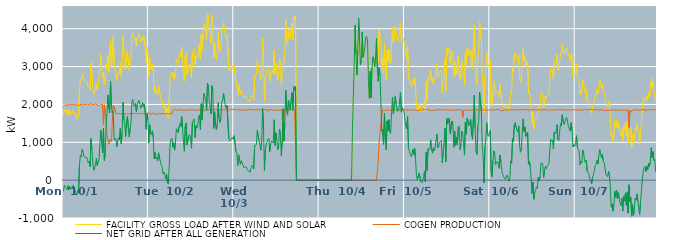
| Category | FACILITY GROSS LOAD AFTER WIND AND SOLAR | COGEN PRODUCTION | NET GRID AFTER ALL GENERATION |
|---|---|---|---|
|  Mon  10/1 | 1690 | 1989 | -299 |
|  Mon  10/1 | 1880 | 2011 | -131 |
|  Mon  10/1 | 1806 | 1982 | -176 |
|  Mon  10/1 | 1848 | 2003 | -155 |
|  Mon  10/1 | 1740 | 1993 | -253 |
|  Mon  10/1 | 1854 | 2001 | -147 |
|  Mon  10/1 | 1728 | 1988 | -260 |
|  Mon  10/1 | 1838 | 2000 | -162 |
|  Mon  10/1 | 1761 | 1996 | -235 |
|  Mon  10/1 | 1754 | 1976 | -222 |
|  Mon  10/1 | 1769 | 1996 | -227 |
|  Mon  10/1 | 1867 | 1996 | -129 |
|  Mon  10/1 | 1845 | 1993 | -148 |
|  Mon  10/1 | 1721 | 1996 | -275 |
|  Mon  10/1 | 1656 | 1991 | -335 |
|  Mon  10/1 | 1599 | 1998 | -399 |
|  Mon  10/1 | 1712 | 1986 | -274 |
|  Mon  10/1 | 1654 | 1993 | -339 |
|  Mon  10/1 | 2359 | 1979 | 380 |
|  Mon  10/1 | 2666 | 2002 | 664 |
|  Mon  10/1 | 2630 | 2011 | 619 |
|  Mon  10/1 | 2792 | 1984 | 808 |
|  Mon  10/1 | 2725 | 1988 | 737 |
|  Mon  10/1 | 2627 | 1998 | 629 |
|  Mon  10/1 | 2595 | 1996 | 599 |
|  Mon  10/1 | 2582 | 2000 | 582 |
|  Mon  10/1 | 2606 | 1997 | 609 |
|  Mon  10/1 | 2538 | 2008 | 530 |
|  Mon  10/1 | 2437 | 1982 | 455 |
|  Mon  10/1 | 2479 | 1986 | 493 |
|  Mon  10/1 | 2375 | 2021 | 354 |
|  Mon  10/1 | 3103 | 2004 | 1099 |
|  Mon  10/1 | 2826 | 2002 | 824 |
|  Mon  10/1 | 2466 | 1991 | 475 |
|  Mon  10/1 | 2257 | 1995 | 262 |
|  Mon  10/1 | 2312 | 1990 | 322 |
|  Mon  10/1 | 2404 | 2010 | 394 |
|  Mon  10/1 | 2561 | 1984 | 577 |
|  Mon  10/1 | 2384 | 1996 | 388 |
|  Mon  10/1 | 2486 | 2002 | 484 |
|  Mon  10/1 | 2501 | 1969 | 532 |
|  Mon  10/1 | 2968 | 1995 | 973 |
|  Mon  10/1 | 3319 | 1997 | 1322 |
|  Mon  10/1 | 2983 | 1998 | 985 |
|  Mon  10/1 | 2719 | 1995 | 724 |
|  Mon  10/1 | 2843 | 1470 | 1373 |
|  Mon  10/1 | 2512 | 1993 | 519 |
|  Mon  10/1 | 2680 | 1994 | 686 |
|  Mon  10/1 | 3076 | 1597 | 1479 |
|  Mon  10/1 | 2936 | 1177 | 1759 |
|  Mon  10/1 | 3300 | 1049 | 2251 |
|  Mon  10/1 | 2853 | 949 | 1904 |
|  Mon  10/1 | 2862 | 1085 | 1777 |
|  Mon  10/1 | 3708 | 1096 | 2612 |
|  Mon  10/1 | 2966 | 1016 | 1950 |
|  Mon  10/1 | 3360 | 1579 | 1781 |
|  Mon  10/1 | 3800 | 1980 | 1820 |
|  Mon  10/1 | 3037 | 1977 | 1060 |
|  Mon  10/1 | 2913 | 1858 | 1055 |
|  Mon  10/1 | 2857 | 1757 | 1100 |
|  Mon  10/1 | 2626 | 1746 | 880 |
|  Mon  10/1 | 2785 | 1753 | 1032 |
|  Mon  10/1 | 2857 | 1735 | 1122 |
|  Mon  10/1 | 2824 | 1765 | 1059 |
|  Mon  10/1 | 3129 | 1764 | 1365 |
|  Mon  10/1 | 2719 | 1752 | 967 |
|  Mon  10/1 | 3023 | 1761 | 1262 |
|  Mon  10/1 | 3808 | 1747 | 2061 |
|  Mon  10/1 | 3344 | 1752 | 1592 |
|  Mon  10/1 | 3209 | 1754 | 1455 |
|  Mon  10/1 | 2909 | 1757 | 1152 |
|  Mon  10/1 | 3344 | 1753 | 1591 |
|  Mon  10/1 | 3433 | 1747 | 1686 |
|  Mon  10/1 | 3119 | 1749 | 1370 |
|  Mon  10/1 | 2896 | 1757 | 1139 |
|  Mon  10/1 | 3126 | 1755 | 1371 |
|  Mon  10/1 | 3274 | 1755 | 1519 |
|  Mon  10/1 | 3838 | 1764 | 2074 |
|  Mon  10/1 | 3889 | 1759 | 2130 |
|  Mon  10/1 | 3741 | 1761 | 1980 |
|  Mon  10/1 | 3699 | 1748 | 1951 |
|  Mon  10/1 | 3786 | 1759 | 2027 |
|  Mon  10/1 | 3548 | 1735 | 1813 |
|  Mon  10/1 | 3758 | 1752 | 2006 |
|  Mon  10/1 | 3778 | 1758 | 2020 |
|  Mon  10/1 | 3877 | 1764 | 2113 |
|  Mon  10/1 | 3764 | 1767 | 1997 |
|  Mon  10/1 | 3649 | 1751 | 1898 |
|  Mon  10/1 | 3698 | 1734 | 1964 |
|  Mon  10/1 | 3805 | 1760 | 2045 |
|  Mon  10/1 | 3687 | 1758 | 1929 |
|  Mon  10/1 | 3750 | 1748 | 2002 |
|  Mon  10/1 | 3511 | 1761 | 1750 |
|  Mon  10/1 | 3116 | 1770 | 1346 |
|  Mon  10/1 | 3520 | 1766 | 1754 |
|  Mon  10/1 | 3369 | 1769 | 1600 |
|  Tue  10/2 | 2745 | 1759 | 986 |
|  Tue  10/2 | 3227 | 1766 | 1461 |
|  Tue  10/2 | 2979 | 1751 | 1228 |
|  Tue  10/2 | 2930 | 1732 | 1198 |
|  Tue  10/2 | 3075 | 1769 | 1306 |
|  Tue  10/2 | 2878 | 1748 | 1130 |
|  Tue  10/2 | 2321 | 1754 | 567 |
|  Tue  10/2 | 2490 | 1759 | 731 |
|  Tue  10/2 | 2297 | 1738 | 559 |
|  Tue  10/2 | 2339 | 1747 | 592 |
|  Tue  10/2 | 2260 | 1751 | 509 |
|  Tue  10/2 | 2479 | 1759 | 720 |
|  Tue  10/2 | 2342 | 1752 | 590 |
|  Tue  10/2 | 2325 | 1746 | 579 |
|  Tue  10/2 | 2138 | 1745 | 393 |
|  Tue  10/2 | 2103 | 1748 | 355 |
|  Tue  10/2 | 1929 | 1765 | 164 |
|  Tue  10/2 | 1973 | 1762 | 211 |
|  Tue  10/2 | 1903 | 1745 | 158 |
|  Tue  10/2 | 1789 | 1758 | 31 |
|  Tue  10/2 | 1913 | 1760 | 153 |
|  Tue  10/2 | 1695 | 1763 | -68 |
|  Tue  10/2 | 1637 | 1744 | -107 |
|  Tue  10/2 | 2150 | 1745 | 405 |
|  Tue  10/2 | 2728 | 1771 | 957 |
|  Tue  10/2 | 2819 | 1746 | 1073 |
|  Tue  10/2 | 2854 | 1744 | 1110 |
|  Tue  10/2 | 2717 | 1848 | 869 |
|  Tue  10/2 | 2844 | 1857 | 987 |
|  Tue  10/2 | 2661 | 1868 | 793 |
|  Tue  10/2 | 2852 | 1855 | 997 |
|  Tue  10/2 | 3205 | 1844 | 1361 |
|  Tue  10/2 | 3183 | 1853 | 1330 |
|  Tue  10/2 | 3115 | 1856 | 1259 |
|  Tue  10/2 | 3258 | 1849 | 1409 |
|  Tue  10/2 | 3359 | 1870 | 1489 |
|  Tue  10/2 | 3263 | 1852 | 1411 |
|  Tue  10/2 | 3520 | 1841 | 1679 |
|  Tue  10/2 | 3197 | 1859 | 1338 |
|  Tue  10/2 | 2848 | 1854 | 994 |
|  Tue  10/2 | 2613 | 1849 | 764 |
|  Tue  10/2 | 3282 | 1849 | 1433 |
|  Tue  10/2 | 3349 | 1839 | 1510 |
|  Tue  10/2 | 2779 | 1852 | 927 |
|  Tue  10/2 | 2777 | 1859 | 918 |
|  Tue  10/2 | 3020 | 1847 | 1173 |
|  Tue  10/2 | 3069 | 1869 | 1200 |
|  Tue  10/2 | 2943 | 1862 | 1081 |
|  Tue  10/2 | 2687 | 1848 | 839 |
|  Tue  10/2 | 3390 | 1862 | 1528 |
|  Tue  10/2 | 3430 | 1859 | 1571 |
|  Tue  10/2 | 3470 | 1854 | 1616 |
|  Tue  10/2 | 2999 | 1873 | 1126 |
|  Tue  10/2 | 3285 | 1847 | 1438 |
|  Tue  10/2 | 3230 | 1852 | 1378 |
|  Tue  10/2 | 3265 | 1849 | 1416 |
|  Tue  10/2 | 3520 | 1839 | 1681 |
|  Tue  10/2 | 3586 | 1863 | 1723 |
|  Tue  10/2 | 3185 | 1857 | 1328 |
|  Tue  10/2 | 3862 | 1842 | 2020 |
|  Tue  10/2 | 3451 | 1850 | 1601 |
|  Tue  10/2 | 3858 | 1849 | 2009 |
|  Tue  10/2 | 4131 | 1844 | 2287 |
|  Tue  10/2 | 4048 | 1851 | 2197 |
|  Tue  10/2 | 3962 | 1865 | 2097 |
|  Tue  10/2 | 3703 | 1856 | 1847 |
|  Tue  10/2 | 4400 | 1847 | 2553 |
|  Tue  10/2 | 4344 | 1862 | 2482 |
|  Tue  10/2 | 3897 | 1839 | 2058 |
|  Tue  10/2 | 3785 | 1849 | 1936 |
|  Tue  10/2 | 3614 | 1866 | 1748 |
|  Tue  10/2 | 4348 | 1851 | 2497 |
|  Tue  10/2 | 4209 | 1855 | 2354 |
|  Tue  10/2 | 3224 | 1858 | 1366 |
|  Tue  10/2 | 3654 | 1847 | 1807 |
|  Tue  10/2 | 3314 | 1869 | 1445 |
|  Tue  10/2 | 3190 | 1863 | 1327 |
|  Tue  10/2 | 3346 | 1850 | 1496 |
|  Tue  10/2 | 3913 | 1867 | 2046 |
|  Tue  10/2 | 3467 | 1835 | 1632 |
|  Tue  10/2 | 3388 | 1862 | 1526 |
|  Tue  10/2 | 3497 | 1858 | 1639 |
|  Tue  10/2 | 3903 | 1857 | 2046 |
|  Tue  10/2 | 3969 | 1856 | 2113 |
|  Tue  10/2 | 4160 | 1858 | 2302 |
|  Tue  10/2 | 3972 | 1851 | 2121 |
|  Tue  10/2 | 3843 | 1860 | 1983 |
|  Tue  10/2 | 3755 | 1859 | 1896 |
|  Tue  10/2 | 3819 | 1843 | 1976 |
|  Tue  10/2 | 3811 | 1859 | 1952 |
|  Tue  10/2 | 2947 | 1846 | 1101 |
|  Tue  10/2 | 2878 | 1844 | 1034 |
|  Tue  10/2 | 2937 | 1869 | 1068 |
|  Tue  10/2 | 2922 | 1850 | 1072 |
|  Tue  10/2 | 3012 | 1882 | 1130 |
|  Tue  10/2 | 2923 | 1848 | 1075 |
|  Wed  10/3 | 3018 | 1843 | 1175 |
|  Wed  10/3 | 3041 | 1874 | 1167 |
|  Wed  10/3 | 2617 | 1856 | 761 |
|  Wed  10/3 | 2565 | 1856 | 709 |
|  Wed  10/3 | 2234 | 1847 | 387 |
|  Wed  10/3 | 2520 | 1854 | 666 |
|  Wed  10/3 | 2405 | 1868 | 537 |
|  Wed  10/3 | 2269 | 1850 | 419 |
|  Wed  10/3 | 2382 | 1870 | 512 |
|  Wed  10/3 | 2331 | 1858 | 473 |
|  Wed  10/3 | 2236 | 1854 | 382 |
|  Wed  10/3 | 2180 | 1846 | 334 |
|  Wed  10/3 | 2199 | 1851 | 348 |
|  Wed  10/3 | 2204 | 1846 | 358 |
|  Wed  10/3 | 2204 | 1871 | 333 |
|  Wed  10/3 | 2134 | 1861 | 273 |
|  Wed  10/3 | 2083 | 1842 | 241 |
|  Wed  10/3 | 2125 | 1865 | 260 |
|  Wed  10/3 | 2075 | 1864 | 211 |
|  Wed  10/3 | 2192 | 1863 | 329 |
|  Wed  10/3 | 2250 | 1865 | 385 |
|  Wed  10/3 | 2207 | 1856 | 351 |
|  Wed  10/3 | 2131 | 1832 | 299 |
|  Wed  10/3 | 2767 | 1855 | 912 |
|  Wed  10/3 | 2767 | 1859 | 908 |
|  Wed  10/3 | 2788 | 1851 | 937 |
|  Wed  10/3 | 3166 | 1852 | 1314 |
|  Wed  10/3 | 3176 | 1862 | 1314 |
|  Wed  10/3 | 2890 | 1845 | 1045 |
|  Wed  10/3 | 2777 | 1856 | 921 |
|  Wed  10/3 | 2655 | 1864 | 791 |
|  Wed  10/3 | 2901 | 1846 | 1055 |
|  Wed  10/3 | 3751 | 1853 | 1898 |
|  Wed  10/3 | 3237 | 1860 | 1377 |
|  Wed  10/3 | 2099 | 1843 | 256 |
|  Wed  10/3 | 2664 | 1857 | 807 |
|  Wed  10/3 | 2777 | 1847 | 930 |
|  Wed  10/3 | 2881 | 1855 | 1026 |
|  Wed  10/3 | 2891 | 1822 | 1069 |
|  Wed  10/3 | 2969 | 1864 | 1105 |
|  Wed  10/3 | 2614 | 1861 | 753 |
|  Wed  10/3 | 2815 | 1864 | 951 |
|  Wed  10/3 | 2883 | 1845 | 1038 |
|  Wed  10/3 | 2914 | 1864 | 1050 |
|  Wed  10/3 | 2818 | 1838 | 980 |
|  Wed  10/3 | 3436 | 1841 | 1595 |
|  Wed  10/3 | 2777 | 1863 | 914 |
|  Wed  10/3 | 3098 | 1846 | 1252 |
|  Wed  10/3 | 2933 | 1861 | 1072 |
|  Wed  10/3 | 2658 | 1848 | 810 |
|  Wed  10/3 | 2756 | 1873 | 883 |
|  Wed  10/3 | 3197 | 1848 | 1349 |
|  Wed  10/3 | 3056 | 1854 | 1202 |
|  Wed  10/3 | 2507 | 1859 | 648 |
|  Wed  10/3 | 2861 | 1829 | 1032 |
|  Wed  10/3 | 2900 | 1013 | 1887 |
|  Wed  10/3 | 2884 | 1845 | 1039 |
|  Wed  10/3 | 3387 | 1862 | 1525 |
|  Wed  10/3 | 4243 | 1867 | 2376 |
|  Wed  10/3 | 3716 | 1845 | 1871 |
|  Wed  10/3 | 3585 | 1868 | 1717 |
|  Wed  10/3 | 3956 | 1850 | 2106 |
|  Wed  10/3 | 3824 | 1844 | 1980 |
|  Wed  10/3 | 3729 | 1869 | 1860 |
|  Wed  10/3 | 3705 | 1861 | 1844 |
|  Wed  10/3 | 4151 | 1840 | 2311 |
|  Wed  10/3 | 3710 | 1860 | 1850 |
|  Wed  10/3 | 4329 | 1859 | 2470 |
|  Wed  10/3 | 4232 | 1855 | 2377 |
|  Wed  10/3 | 4339 | 1863 | 2476 |
|  Wed  10/3 | 0 | 0 | 0 |
|  Wed  10/3 | 0 | 0 | 0 |
|  Wed  10/3 | 0 | 0 | 0 |
|  Wed  10/3 | 0 | 0 | 0 |
|  Wed  10/3 | 0 | 0 | 0 |
|  Wed  10/3 | 0 | 0 | 0 |
|  Wed  10/3 | 0 | 0 | 0 |
|  Wed  10/3 | 0 | 0 | 0 |
|  Wed  10/3 | 0 | 0 | 0 |
|  Wed  10/3 | 0 | 0 | 0 |
|  Wed  10/3 | 0 | 0 | 0 |
|  Wed  10/3 | 0 | 0 | 0 |
|  Wed  10/3 | 0 | 0 | 0 |
|  Wed  10/3 | 0 | 0 | 0 |
|  Wed  10/3 | 0 | 0 | 0 |
|  Wed  10/3 | 0 | 0 | 0 |
|  Wed  10/3 | 0 | 0 | 0 |
|  Wed  10/3 | 0 | 0 | 0 |
|  Wed  10/3 | 0 | 0 | 0 |
|  Wed  10/3 | 0 | 0 | 0 |
|  Wed  10/3 | 0 | 0 | 0 |
|  Wed  10/3 | 0 | 0 | 0 |
|  Wed  10/3 | 0 | 0 | 0 |
|  Wed  10/3 | 0 | 0 | 0 |
|  Wed  10/3 | 0 | 0 | 0 |
|  Wed  10/3 | 0 | 0 | 0 |
|  Thu  10/4 | 0 | 0 | 0 |
|  Thu  10/4 | 0 | 0 | 0 |
|  Thu  10/4 | 0 | 0 | 0 |
|  Thu  10/4 | 0 | 0 | 0 |
|  Thu  10/4 | 0 | 0 | 0 |
|  Thu  10/4 | 0 | 0 | 0 |
|  Thu  10/4 | 0 | 0 | 0 |
|  Thu  10/4 | 0 | 0 | 0 |
|  Thu  10/4 | 0 | 0 | 0 |
|  Thu  10/4 | 0 | 0 | 0 |
|  Thu  10/4 | 0 | 0 | 0 |
|  Thu  10/4 | 0 | 0 | 0 |
|  Thu  10/4 | 0 | 0 | 0 |
|  Thu  10/4 | 0 | 0 | 0 |
|  Thu  10/4 | 0 | 0 | 0 |
|  Thu  10/4 | 0 | 0 | 0 |
|  Thu  10/4 | 0 | 0 | 0 |
|  Thu  10/4 | 0 | 0 | 0 |
|  Thu  10/4 | 0 | 0 | 0 |
|  Thu  10/4 | 0 | 0 | 0 |
|  Thu  10/4 | 0 | 0 | 0 |
|  Thu  10/4 | 0 | 0 | 0 |
|  Thu  10/4 | 0 | 0 | 0 |
|  Thu  10/4 | 0 | 0 | 0 |
|  Thu  10/4 | 0 | 0 | 0 |
|  Thu  10/4 | 0 | 0 | 0 |
|  Thu  10/4 | 0 | 0 | 0 |
|  Thu  10/4 | 0 | 0 | 0 |
|  Thu  10/4 | 0 | 0 | 0 |
|  Thu  10/4 | 0 | 0 | 0 |
|  Thu  10/4 | 0 | 0 | 0 |
|  Thu  10/4 | 0 | 0 | 0 |
|  Thu  10/4 | 0 | 0 | 0 |
|  Thu  10/4 | 0 | 0 | 0 |
|  Thu  10/4 | 0 | 0 | 0 |
|  Thu  10/4 | 0 | 0 | 0 |
|  Thu  10/4 | 0 | 0 | 0 |
|  Thu  10/4 | 1342 | 0 | 1342 |
|  Thu  10/4 | 2233 | 0 | 2233 |
|  Thu  10/4 | 3062 | 0 | 3062 |
|  Thu  10/4 | 4096 | 0 | 4096 |
|  Thu  10/4 | 3315 | 0 | 3315 |
|  Thu  10/4 | 2775 | 0 | 2775 |
|  Thu  10/4 | 3445 | 0 | 3445 |
|  Thu  10/4 | 4273 | 0 | 4273 |
|  Thu  10/4 | 3673 | 0 | 3673 |
|  Thu  10/4 | 3043 | 0 | 3043 |
|  Thu  10/4 | 3152 | 0 | 3152 |
|  Thu  10/4 | 3918 | 0 | 3918 |
|  Thu  10/4 | 3248 | 0 | 3248 |
|  Thu  10/4 | 3373 | 0 | 3373 |
|  Thu  10/4 | 3518 | 0 | 3518 |
|  Thu  10/4 | 3773 | 0 | 3773 |
|  Thu  10/4 | 3800 | 0 | 3800 |
|  Thu  10/4 | 3708 | 0 | 3708 |
|  Thu  10/4 | 2610 | 0 | 2610 |
|  Thu  10/4 | 2160 | 0 | 2160 |
|  Thu  10/4 | 2877 | 0 | 2877 |
|  Thu  10/4 | 2172 | 0 | 2172 |
|  Thu  10/4 | 2960 | 0 | 2960 |
|  Thu  10/4 | 3260 | 0 | 3260 |
|  Thu  10/4 | 3163 | 0 | 3163 |
|  Thu  10/4 | 2994 | 0 | 2994 |
|  Thu  10/4 | 3251 | 0 | 3251 |
|  Thu  10/4 | 3745 | 0 | 3745 |
|  Thu  10/4 | 3204 | 248 | 2956 |
|  Thu  10/4 | 3110 | 498 | 2612 |
|  Thu  10/4 | 3994 | 1019 | 2975 |
|  Thu  10/4 | 3784 | 1015 | 2769 |
|  Thu  10/4 | 3556 | 1514 | 2042 |
|  Thu  10/4 | 2979 | 1693 | 1286 |
|  Thu  10/4 | 3207 | 1858 | 1349 |
|  Thu  10/4 | 2801 | 1855 | 946 |
|  Thu  10/4 | 3616 | 1845 | 1771 |
|  Thu  10/4 | 2910 | 1845 | 1065 |
|  Thu  10/4 | 2654 | 1847 | 807 |
|  Thu  10/4 | 3426 | 1859 | 1567 |
|  Thu  10/4 | 3162 | 1855 | 1307 |
|  Thu  10/4 | 3466 | 1869 | 1597 |
|  Thu  10/4 | 3126 | 1851 | 1275 |
|  Thu  10/4 | 3074 | 1837 | 1237 |
|  Thu  10/4 | 3619 | 1838 | 1781 |
|  Thu  10/4 | 4038 | 1854 | 2184 |
|  Thu  10/4 | 3615 | 1857 | 1758 |
|  Thu  10/4 | 3785 | 1842 | 1943 |
|  Thu  10/4 | 4064 | 1853 | 2211 |
|  Thu  10/4 | 4048 | 1860 | 2188 |
|  Thu  10/4 | 3729 | 1860 | 1869 |
|  Thu  10/4 | 3661 | 1844 | 1817 |
|  Thu  10/4 | 3712 | 1861 | 1851 |
|  Thu  10/4 | 3710 | 1857 | 1853 |
|  Thu  10/4 | 4159 | 1847 | 2312 |
|  Thu  10/4 | 3659 | 1862 | 1797 |
|  Thu  10/4 | 3790 | 1869 | 1921 |
|  Thu  10/4 | 3739 | 1872 | 1867 |
|  Thu  10/4 | 3660 | 1852 | 1808 |
|  Fri  10/5 | 3459 | 1864 | 1595 |
|  Fri  10/5 | 3310 | 1881 | 1429 |
|  Fri  10/5 | 3192 | 1841 | 1351 |
|  Fri  10/5 | 3538 | 1855 | 1683 |
|  Fri  10/5 | 2700 | 1844 | 856 |
|  Fri  10/5 | 2630 | 1865 | 765 |
|  Fri  10/5 | 2531 | 1852 | 679 |
|  Fri  10/5 | 2478 | 1854 | 624 |
|  Fri  10/5 | 2550 | 1858 | 692 |
|  Fri  10/5 | 2662 | 1848 | 814 |
|  Fri  10/5 | 2517 | 1853 | 664 |
|  Fri  10/5 | 2713 | 1870 | 843 |
|  Fri  10/5 | 2415 | 1857 | 558 |
|  Fri  10/5 | 1972 | 1860 | 112 |
|  Fri  10/5 | 1849 | 1832 | 17 |
|  Fri  10/5 | 1881 | 1855 | 26 |
|  Fri  10/5 | 2033 | 1853 | 180 |
|  Fri  10/5 | 2016 | 1849 | 167 |
|  Fri  10/5 | 1808 | 1844 | -36 |
|  Fri  10/5 | 1791 | 1862 | -71 |
|  Fri  10/5 | 1863 | 1875 | -12 |
|  Fri  10/5 | 1958 | 1859 | 99 |
|  Fri  10/5 | 2094 | 1856 | 238 |
|  Fri  10/5 | 1811 | 1856 | -45 |
|  Fri  10/5 | 2601 | 1868 | 733 |
|  Fri  10/5 | 2109 | 1852 | 257 |
|  Fri  10/5 | 2680 | 1852 | 828 |
|  Fri  10/5 | 2712 | 1862 | 850 |
|  Fri  10/5 | 2673 | 1859 | 814 |
|  Fri  10/5 | 2896 | 1832 | 1064 |
|  Fri  10/5 | 2650 | 1852 | 798 |
|  Fri  10/5 | 2557 | 1843 | 714 |
|  Fri  10/5 | 2700 | 1846 | 854 |
|  Fri  10/5 | 2622 | 1842 | 780 |
|  Fri  10/5 | 2707 | 1861 | 846 |
|  Fri  10/5 | 2914 | 1852 | 1062 |
|  Fri  10/5 | 3077 | 1857 | 1220 |
|  Fri  10/5 | 2705 | 1856 | 849 |
|  Fri  10/5 | 2756 | 1863 | 893 |
|  Fri  10/5 | 2869 | 1865 | 1004 |
|  Fri  10/5 | 2886 | 1866 | 1020 |
|  Fri  10/5 | 2899 | 1854 | 1045 |
|  Fri  10/5 | 2312 | 1852 | 460 |
|  Fri  10/5 | 2599 | 1867 | 732 |
|  Fri  10/5 | 2799 | 1835 | 964 |
|  Fri  10/5 | 3212 | 1841 | 1371 |
|  Fri  10/5 | 2353 | 1869 | 484 |
|  Fri  10/5 | 3496 | 1860 | 1636 |
|  Fri  10/5 | 3323 | 1842 | 1481 |
|  Fri  10/5 | 3433 | 1846 | 1587 |
|  Fri  10/5 | 3505 | 1862 | 1643 |
|  Fri  10/5 | 3078 | 1853 | 1225 |
|  Fri  10/5 | 3061 | 1842 | 1219 |
|  Fri  10/5 | 3413 | 1854 | 1559 |
|  Fri  10/5 | 3314 | 1854 | 1460 |
|  Fri  10/5 | 2725 | 1858 | 867 |
|  Fri  10/5 | 3137 | 1841 | 1296 |
|  Fri  10/5 | 2765 | 1850 | 915 |
|  Fri  10/5 | 2984 | 1855 | 1129 |
|  Fri  10/5 | 2795 | 1864 | 931 |
|  Fri  10/5 | 3267 | 1865 | 1402 |
|  Fri  10/5 | 3277 | 1846 | 1431 |
|  Fri  10/5 | 2665 | 1857 | 808 |
|  Fri  10/5 | 2791 | 1854 | 937 |
|  Fri  10/5 | 3139 | 1847 | 1292 |
|  Fri  10/5 | 2849 | 1649 | 1200 |
|  Fri  10/5 | 2822 | 1853 | 969 |
|  Fri  10/5 | 2525 | 1864 | 661 |
|  Fri  10/5 | 3377 | 1844 | 1533 |
|  Fri  10/5 | 3058 | 1842 | 1216 |
|  Fri  10/5 | 3489 | 1856 | 1633 |
|  Fri  10/5 | 3454 | 1864 | 1590 |
|  Fri  10/5 | 3286 | 1844 | 1442 |
|  Fri  10/5 | 3380 | 1862 | 1518 |
|  Fri  10/5 | 3452 | 1851 | 1601 |
|  Fri  10/5 | 3039 | 1838 | 1201 |
|  Fri  10/5 | 2940 | 1858 | 1082 |
|  Fri  10/5 | 3526 | 1878 | 1648 |
|  Fri  10/5 | 4113 | 1866 | 2247 |
|  Fri  10/5 | 3204 | 1845 | 1359 |
|  Fri  10/5 | 2602 | 1853 | 749 |
|  Fri  10/5 | 2526 | 1847 | 679 |
|  Fri  10/5 | 3264 | 1856 | 1408 |
|  Fri  10/5 | 3403 | 1852 | 1551 |
|  Fri  10/5 | 4164 | 1835 | 2329 |
|  Fri  10/5 | 4190 | 1859 | 2331 |
|  Fri  10/5 | 3683 | 1859 | 1824 |
|  Fri  10/5 | 2740 | 1864 | 876 |
|  Fri  10/5 | 2481 | 1849 | 632 |
|  Fri  10/5 | 1778 | 1855 | -77 |
|  Fri  10/5 | 2747 | 1853 | 894 |
|  Fri  10/5 | 2950 | 1860 | 1090 |
|  Fri  10/5 | 3370 | 1851 | 1519 |
|  Fri  10/5 | 3044 | 1841 | 1203 |
|  Fri  10/5 | 3011 | 1853 | 1158 |
|  Fri  10/5 | 3096 | 1834 | 1262 |
|  Sat  10/6 | 3170 | 1860 | 1310 |
|  Sat  10/6 | 2062 | 1849 | 213 |
|  Sat  10/6 | 1946 | 1858 | 88 |
|  Sat  10/6 | 2346 | 1839 | 507 |
|  Sat  10/6 | 2625 | 1854 | 771 |
|  Sat  10/6 | 2555 | 1851 | 704 |
|  Sat  10/6 | 2266 | 1858 | 408 |
|  Sat  10/6 | 2313 | 1838 | 475 |
|  Sat  10/6 | 2359 | 1868 | 491 |
|  Sat  10/6 | 2331 | 1854 | 477 |
|  Sat  10/6 | 2176 | 1864 | 312 |
|  Sat  10/6 | 2520 | 1859 | 661 |
|  Sat  10/6 | 2303 | 1828 | 475 |
|  Sat  10/6 | 2097 | 1852 | 245 |
|  Sat  10/6 | 1990 | 1840 | 150 |
|  Sat  10/6 | 2005 | 1855 | 150 |
|  Sat  10/6 | 1908 | 1852 | 56 |
|  Sat  10/6 | 1881 | 1859 | 22 |
|  Sat  10/6 | 1895 | 1860 | 35 |
|  Sat  10/6 | 2002 | 1863 | 139 |
|  Sat  10/6 | 1977 | 1844 | 133 |
|  Sat  10/6 | 1826 | 1853 | -27 |
|  Sat  10/6 | 1904 | 1860 | 44 |
|  Sat  10/6 | 2349 | 1842 | 507 |
|  Sat  10/6 | 2308 | 1859 | 449 |
|  Sat  10/6 | 2953 | 1859 | 1094 |
|  Sat  10/6 | 2869 | 1857 | 1012 |
|  Sat  10/6 | 3294 | 1846 | 1448 |
|  Sat  10/6 | 3374 | 1856 | 1518 |
|  Sat  10/6 | 3236 | 1842 | 1394 |
|  Sat  10/6 | 3227 | 1856 | 1371 |
|  Sat  10/6 | 3125 | 1851 | 1274 |
|  Sat  10/6 | 3293 | 1860 | 1433 |
|  Sat  10/6 | 2747 | 1836 | 911 |
|  Sat  10/6 | 2591 | 1854 | 737 |
|  Sat  10/6 | 2708 | 1849 | 859 |
|  Sat  10/6 | 3156 | 1864 | 1292 |
|  Sat  10/6 | 3469 | 1849 | 1620 |
|  Sat  10/6 | 3154 | 1870 | 1284 |
|  Sat  10/6 | 3240 | 1844 | 1396 |
|  Sat  10/6 | 3008 | 1852 | 1156 |
|  Sat  10/6 | 3003 | 1860 | 1143 |
|  Sat  10/6 | 3139 | 1867 | 1272 |
|  Sat  10/6 | 2287 | 1862 | 425 |
|  Sat  10/6 | 2344 | 1846 | 498 |
|  Sat  10/6 | 2204 | 1847 | 357 |
|  Sat  10/6 | 1876 | 1864 | 12 |
|  Sat  10/6 | 1498 | 1849 | -351 |
|  Sat  10/6 | 1799 | 1852 | -53 |
|  Sat  10/6 | 1353 | 1858 | -505 |
|  Sat  10/6 | 1550 | 1867 | -317 |
|  Sat  10/6 | 1613 | 1878 | -265 |
|  Sat  10/6 | 1666 | 1843 | -177 |
|  Sat  10/6 | 1635 | 1848 | -213 |
|  Sat  10/6 | 1939 | 1863 | 76 |
|  Sat  10/6 | 1852 | 1874 | -22 |
|  Sat  10/6 | 1956 | 1858 | 98 |
|  Sat  10/6 | 2313 | 1856 | 457 |
|  Sat  10/6 | 2298 | 1847 | 451 |
|  Sat  10/6 | 2283 | 1855 | 428 |
|  Sat  10/6 | 1926 | 1858 | 68 |
|  Sat  10/6 | 2104 | 1864 | 240 |
|  Sat  10/6 | 2224 | 1858 | 366 |
|  Sat  10/6 | 2152 | 1850 | 302 |
|  Sat  10/6 | 2215 | 1852 | 363 |
|  Sat  10/6 | 2253 | 1855 | 398 |
|  Sat  10/6 | 2302 | 1846 | 456 |
|  Sat  10/6 | 2654 | 1860 | 794 |
|  Sat  10/6 | 2940 | 1862 | 1078 |
|  Sat  10/6 | 2877 | 1848 | 1029 |
|  Sat  10/6 | 2906 | 1844 | 1062 |
|  Sat  10/6 | 2669 | 1842 | 827 |
|  Sat  10/6 | 3129 | 1856 | 1273 |
|  Sat  10/6 | 3124 | 1864 | 1260 |
|  Sat  10/6 | 3094 | 1859 | 1235 |
|  Sat  10/6 | 3326 | 1862 | 1464 |
|  Sat  10/6 | 2941 | 1864 | 1077 |
|  Sat  10/6 | 2898 | 1855 | 1043 |
|  Sat  10/6 | 3136 | 1854 | 1282 |
|  Sat  10/6 | 3343 | 1852 | 1491 |
|  Sat  10/6 | 3298 | 1868 | 1430 |
|  Sat  10/6 | 3580 | 1852 | 1728 |
|  Sat  10/6 | 3410 | 1848 | 1562 |
|  Sat  10/6 | 3337 | 1864 | 1473 |
|  Sat  10/6 | 3309 | 1853 | 1456 |
|  Sat  10/6 | 3483 | 1860 | 1623 |
|  Sat  10/6 | 3510 | 1851 | 1659 |
|  Sat  10/6 | 3395 | 1861 | 1534 |
|  Sat  10/6 | 3271 | 1859 | 1412 |
|  Sat  10/6 | 3236 | 1847 | 1389 |
|  Sat  10/6 | 3144 | 1849 | 1295 |
|  Sat  10/6 | 3348 | 1830 | 1518 |
|  Sat  10/6 | 3161 | 1859 | 1302 |
|  Sat  10/6 | 2742 | 1864 | 878 |
|  Sat  10/6 | 2800 | 1862 | 938 |
|  Sat  10/6 | 2752 | 1861 | 891 |
|  Sun  10/7 | 2855 | 1854 | 1001 |
|  Sun  10/7 | 3055 | 1880 | 1175 |
|  Sun  10/7 | 2715 | 1846 | 869 |
|  Sun  10/7 | 2655 | 1856 | 799 |
|  Sun  10/7 | 2618 | 1849 | 769 |
|  Sun  10/7 | 2243 | 1842 | 401 |
|  Sun  10/7 | 2345 | 1850 | 495 |
|  Sun  10/7 | 2315 | 1859 | 456 |
|  Sun  10/7 | 2642 | 1850 | 792 |
|  Sun  10/7 | 2584 | 1863 | 721 |
|  Sun  10/7 | 2374 | 1867 | 507 |
|  Sun  10/7 | 2314 | 1849 | 465 |
|  Sun  10/7 | 2389 | 1859 | 530 |
|  Sun  10/7 | 2081 | 1854 | 227 |
|  Sun  10/7 | 2061 | 1863 | 198 |
|  Sun  10/7 | 2005 | 1861 | 144 |
|  Sun  10/7 | 1878 | 1870 | 8 |
|  Sun  10/7 | 1827 | 1851 | -24 |
|  Sun  10/7 | 1765 | 1860 | -95 |
|  Sun  10/7 | 1924 | 1854 | 70 |
|  Sun  10/7 | 2015 | 1867 | 148 |
|  Sun  10/7 | 2098 | 1865 | 233 |
|  Sun  10/7 | 2232 | 1850 | 382 |
|  Sun  10/7 | 2278 | 1864 | 414 |
|  Sun  10/7 | 2385 | 1866 | 519 |
|  Sun  10/7 | 2282 | 1854 | 428 |
|  Sun  10/7 | 2487 | 1850 | 637 |
|  Sun  10/7 | 2650 | 1844 | 806 |
|  Sun  10/7 | 2560 | 1858 | 702 |
|  Sun  10/7 | 2451 | 1851 | 600 |
|  Sun  10/7 | 2535 | 1853 | 682 |
|  Sun  10/7 | 2367 | 1857 | 510 |
|  Sun  10/7 | 2312 | 1841 | 471 |
|  Sun  10/7 | 2188 | 1865 | 323 |
|  Sun  10/7 | 1999 | 1841 | 158 |
|  Sun  10/7 | 1991 | 1858 | 133 |
|  Sun  10/7 | 1931 | 1842 | 89 |
|  Sun  10/7 | 2100 | 1859 | 241 |
|  Sun  10/7 | 1952 | 1841 | 111 |
|  Sun  10/7 | 1717 | 1854 | -137 |
|  Sun  10/7 | 1140 | 1854 | -714 |
|  Sun  10/7 | 1218 | 1843 | -625 |
|  Sun  10/7 | 1039 | 1857 | -818 |
|  Sun  10/7 | 1187 | 1857 | -670 |
|  Sun  10/7 | 1567 | 1858 | -291 |
|  Sun  10/7 | 1400 | 1855 | -455 |
|  Sun  10/7 | 1576 | 1837 | -261 |
|  Sun  10/7 | 1356 | 1842 | -486 |
|  Sun  10/7 | 1530 | 1860 | -330 |
|  Sun  10/7 | 1383 | 1863 | -480 |
|  Sun  10/7 | 1212 | 1839 | -627 |
|  Sun  10/7 | 1168 | 1845 | -677 |
|  Sun  10/7 | 1385 | 1859 | -474 |
|  Sun  10/7 | 1040 | 1857 | -817 |
|  Sun  10/7 | 1420 | 1845 | -425 |
|  Sun  10/7 | 1299 | 1847 | -548 |
|  Sun  10/7 | 1511 | 1855 | -344 |
|  Sun  10/7 | 1165 | 1828 | -663 |
|  Sun  10/7 | 1542 | 1853 | -311 |
|  Sun  10/7 | 983 | 1853 | -870 |
|  Sun  10/7 | 1261 | 1383 | -122 |
|  Sun  10/7 | 1269 | 1839 | -570 |
|  Sun  10/7 | 1395 | 1854 | -459 |
|  Sun  10/7 | 856 | 1808 | -952 |
|  Sun  10/7 | 1205 | 1847 | -642 |
|  Sun  10/7 | 929 | 1856 | -927 |
|  Sun  10/7 | 1055 | 1857 | -802 |
|  Sun  10/7 | 1371 | 1846 | -475 |
|  Sun  10/7 | 1329 | 1857 | -528 |
|  Sun  10/7 | 1502 | 1866 | -364 |
|  Sun  10/7 | 1299 | 1857 | -558 |
|  Sun  10/7 | 1327 | 1874 | -547 |
|  Sun  10/7 | 945 | 1853 | -908 |
|  Sun  10/7 | 1278 | 1850 | -572 |
|  Sun  10/7 | 1270 | 1851 | -581 |
|  Sun  10/7 | 1849 | 1840 | 9 |
|  Sun  10/7 | 2102 | 1866 | 236 |
|  Sun  10/7 | 2194 | 1867 | 327 |
|  Sun  10/7 | 2219 | 1852 | 367 |
|  Sun  10/7 | 2077 | 1857 | 220 |
|  Sun  10/7 | 2208 | 1850 | 358 |
|  Sun  10/7 | 2129 | 1856 | 273 |
|  Sun  10/7 | 2314 | 1862 | 452 |
|  Sun  10/7 | 2211 | 1857 | 354 |
|  Sun  10/7 | 2347 | 1862 | 485 |
|  Sun  10/7 | 2699 | 1840 | 859 |
|  Sun  10/7 | 2451 | 1857 | 594 |
|  Sun  10/7 | 2611 | 1855 | 756 |
|  Sun  10/7 | 2370 | 1854 | 516 |
|  Sun  10/7 | 2385 | 1841 | 544 |
|  Sun  10/7 | 2082 | 1857 | 225 |
|  Sun  10/7 | 2119 | 1858 | 261 |